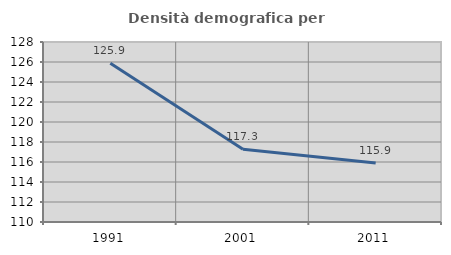
| Category | Densità demografica |
|---|---|
| 1991.0 | 125.873 |
| 2001.0 | 117.285 |
| 2011.0 | 115.903 |